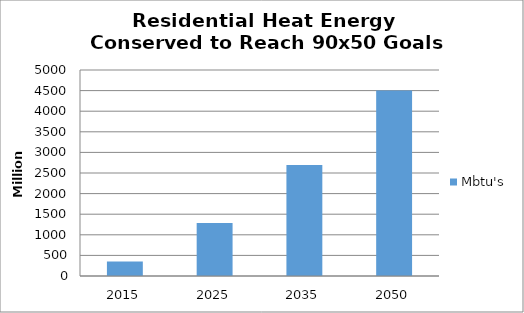
| Category | Mbtu's |
|---|---|
| 2015.0 | 352.591 |
| 2025.0 | 1284.997 |
| 2035.0 | 2695.36 |
| 2050.0 | 4505.325 |